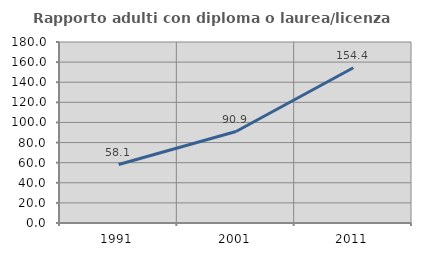
| Category | Rapporto adulti con diploma o laurea/licenza media  |
|---|---|
| 1991.0 | 58.114 |
| 2001.0 | 90.945 |
| 2011.0 | 154.405 |